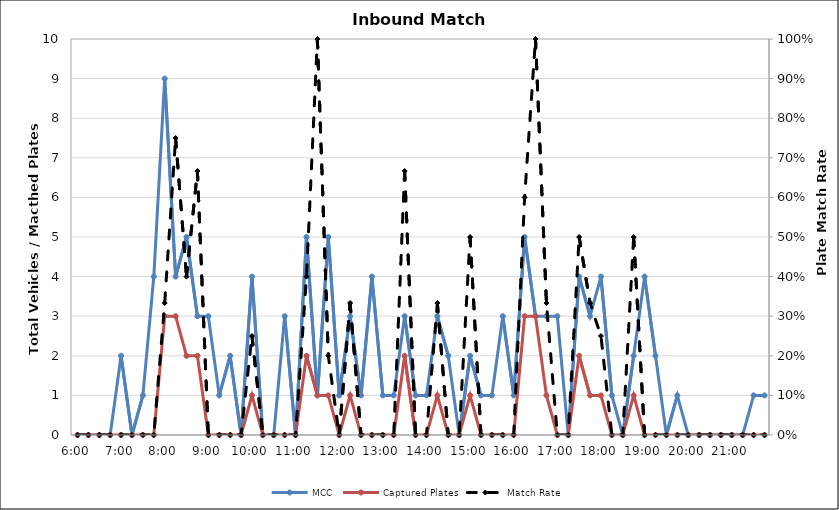
| Category | MCC | Captured Plates |
|---|---|---|
| 0.25 | 0 | 0 |
| 0.260416666666667 | 0 | 0 |
| 0.270833333333333 | 0 | 0 |
| 0.28125 | 0 | 0 |
| 0.291666666666667 | 2 | 0 |
| 0.302083333333333 | 0 | 0 |
| 0.3125 | 1 | 0 |
| 0.322916666666667 | 4 | 0 |
| 0.333333333333333 | 9 | 3 |
| 0.34375 | 4 | 3 |
| 0.354166666666667 | 5 | 2 |
| 0.364583333333333 | 3 | 2 |
| 0.375 | 3 | 0 |
| 0.385416666666667 | 1 | 0 |
| 0.395833333333333 | 2 | 0 |
| 0.40625 | 0 | 0 |
| 0.416666666666667 | 4 | 1 |
| 0.427083333333333 | 0 | 0 |
| 0.4375 | 0 | 0 |
| 0.447916666666667 | 3 | 0 |
| 0.458333333333333 | 0 | 0 |
| 0.46875 | 5 | 2 |
| 0.479166666666667 | 1 | 1 |
| 0.489583333333333 | 5 | 1 |
| 0.5 | 1 | 0 |
| 0.510416666666667 | 3 | 1 |
| 0.520833333333333 | 1 | 0 |
| 0.53125 | 4 | 0 |
| 0.541666666666667 | 1 | 0 |
| 0.552083333333333 | 1 | 0 |
| 0.5625 | 3 | 2 |
| 0.572916666666667 | 1 | 0 |
| 0.583333333333333 | 1 | 0 |
| 0.59375 | 3 | 1 |
| 0.604166666666667 | 2 | 0 |
| 0.614583333333333 | 0 | 0 |
| 0.625 | 2 | 1 |
| 0.635416666666667 | 1 | 0 |
| 0.645833333333333 | 1 | 0 |
| 0.65625 | 3 | 0 |
| 0.666666666666667 | 1 | 0 |
| 0.677083333333333 | 5 | 3 |
| 0.6875 | 3 | 3 |
| 0.697916666666667 | 3 | 1 |
| 0.708333333333333 | 3 | 0 |
| 0.71875 | 0 | 0 |
| 0.729166666666667 | 4 | 2 |
| 0.739583333333333 | 3 | 1 |
| 0.75 | 4 | 1 |
| 0.760416666666667 | 1 | 0 |
| 0.770833333333333 | 0 | 0 |
| 0.78125 | 2 | 1 |
| 0.791666666666667 | 4 | 0 |
| 0.802083333333333 | 2 | 0 |
| 0.8125 | 0 | 0 |
| 0.822916666666667 | 1 | 0 |
| 0.833333333333333 | 0 | 0 |
| 0.84375 | 0 | 0 |
| 0.854166666666667 | 0 | 0 |
| 0.864583333333333 | 0 | 0 |
| 0.875 | 0 | 0 |
| 0.885416666666667 | 0 | 0 |
| 0.895833333333333 | 1 | 0 |
| 0.90625 | 1 | 0 |